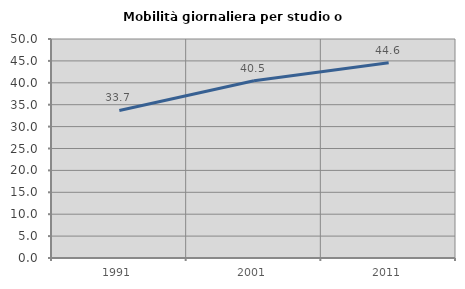
| Category | Mobilità giornaliera per studio o lavoro |
|---|---|
| 1991.0 | 33.681 |
| 2001.0 | 40.481 |
| 2011.0 | 44.558 |